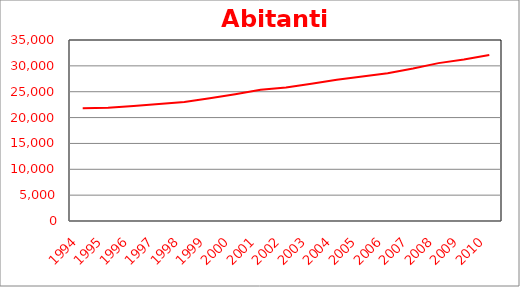
| Category | Abitanti (n.) |
|---|---|
| 1994.0 | 21799 |
| 1995.0 | 21920 |
| 1996.0 | 22240 |
| 1997.0 | 22603 |
| 1998.0 | 23011 |
| 1999.0 | 23753 |
| 2000.0 | 24518 |
| 2001.0 | 25359 |
| 2002.0 | 25821 |
| 2003.0 | 26535 |
| 2004.0 | 27324 |
| 2005.0 | 27921 |
| 2006.0 | 28570 |
| 2007.0 | 29476 |
| 2008.0 | 30527 |
| 2009.0 | 31229 |
| 2010.0 | 32102 |